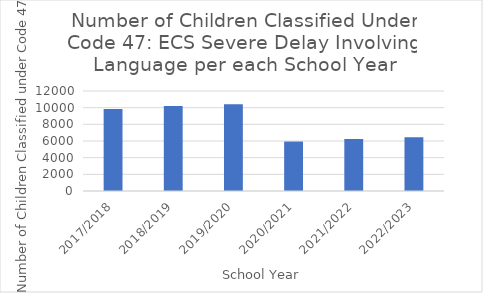
| Category | Series 0 |
|---|---|
| 2017/2018 | 9828 |
| 2018/2019 | 10189 |
| 2019/2020 | 10405 |
| 2020/2021 | 5936 |
| 2021/2022 | 6253 |
| 2022/2023 | 6458 |